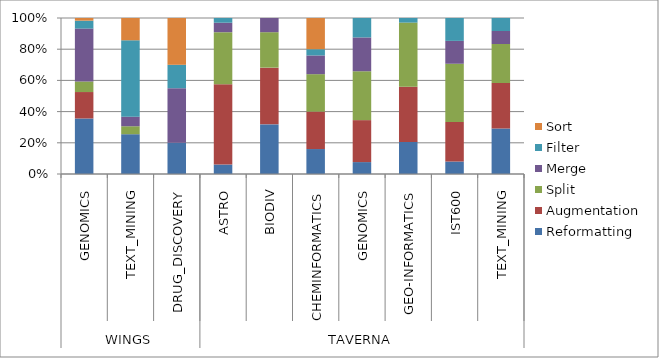
| Category | Reformatting | Augmentation | Split | Merge | Filter  | Sort |
|---|---|---|---|---|---|---|
| 0 | 21 | 10 | 4 | 20 | 3 | 1 |
| 1 | 25 | 0 | 5 | 6 | 48 | 14 |
| 2 | 4 | 0 | 0 | 7 | 3 | 6 |
| 3 | 2 | 17 | 11 | 2 | 1 | 0 |
| 4 | 7 | 8 | 5 | 2 | 0 | 0 |
| 5 | 4 | 6 | 6 | 3 | 1 | 5 |
| 6 | 19 | 67 | 78 | 54 | 31 | 0 |
| 7 | 7 | 12 | 14 | 0 | 1 | 0 |
| 8 | 6 | 19 | 28 | 11 | 11 | 0 |
| 9 | 7 | 7 | 6 | 2 | 2 | 0 |